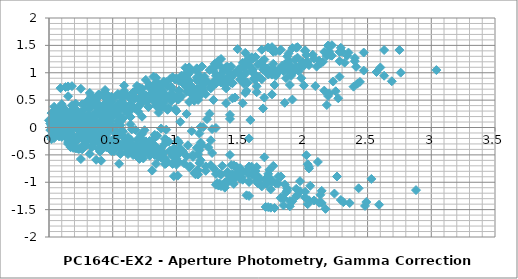
| Category | Series 0 |
|---|---|
| 0.1899999999999995 | 0.112 |
| 1.8800000000000008 | 1.221 |
| 0.2400000000000002 | 0.2 |
| 2.1799999999999997 | 1.307 |
| 1.4399999999999995 | 0.937 |
| 1.6300000000000008 | 0.644 |
| 0.7200000000000006 | 0.435 |
| 0.47000000000000064 | 0.271 |
| 1.9499999999999993 | 1.276 |
| 1.2100000000000009 | 0.788 |
| 1.7599999999999998 | 1.383 |
| 0.13000000000000078 | -0.057 |
| 0.0600000000000005 | -0.068 |
| 0.9499999999999993 | 0.597 |
| 2.08 | 1.258 |
| 0.3800000000000008 | 0.283 |
| 1.0500000000000007 | 0.809 |
| 1.3900000000000006 | 0.792 |
| 0.7799999999999994 | 0.494 |
| 2.0700000000000003 | 1.33 |
| 2.4700000000000006 | 1.04 |
| 0.41000000000000014 | -0.103 |
| 0.4499999999999993 | 0.535 |
| 0.35999999999999943 | 0.412 |
| 1.3499999999999996 | 0.975 |
| 1.9900000000000002 | 1.166 |
| 1.9100000000000001 | 1.081 |
| 1.7799999999999994 | 1.394 |
| 0.21000000000000085 | 0.145 |
| 1.8800000000000008 | 1.352 |
| 0.4399999999999995 | 0.369 |
| 0.0600000000000005 | 0.101 |
| 0.4299999999999997 | 0.322 |
| 1.8100000000000005 | 1.4 |
| 0.040000000000000924 | -0.071 |
| 2.34 | 1.312 |
| 2.2200000000000006 | 1.312 |
| 1.5500000000000007 | 1.001 |
| 2.630000000000001 | 0.945 |
| 1.5899999999999999 | 1.022 |
| 1.540000000000001 | 1.364 |
| 1.2599999999999998 | 1.047 |
| 0.9000000000000004 | 0.841 |
| 1.1600000000000001 | 1.031 |
| 1.6900000000000013 | 1.109 |
| 0.05000000000000071 | 0.088 |
| 1.9900000000000002 | 1.195 |
| 1.25 | 0.825 |
| 1.4400000000000013 | 0.533 |
| 0.5300000000000011 | 0.323 |
| 0.28000000000000114 | 0.16 |
| 1.7599999999999998 | 1.164 |
| 1.0200000000000014 | 0.676 |
| 1.5700000000000003 | 1.271 |
| 0.3200000000000003 | -0.169 |
| 0.129999999999999 | -0.18 |
| 0.7599999999999998 | 0.485 |
| 1.8900000000000006 | 1.146 |
| 0.19000000000000128 | 0.171 |
| 0.8600000000000012 | 0.697 |
| 1.200000000000001 | 0.68 |
| 0.5899999999999999 | 0.382 |
| 1.8800000000000008 | 1.218 |
| 2.280000000000001 | 0.928 |
| 0.5999999999999996 | -0.215 |
| 0.2599999999999998 | 0.423 |
| 0.16999999999999993 | 0.3 |
| 1.1600000000000001 | 0.863 |
| 1.8000000000000007 | 1.054 |
| 1.7200000000000006 | 0.969 |
| 1.5899999999999999 | 1.282 |
| 0.02000000000000135 | 0.033 |
| 1.6900000000000013 | 1.241 |
| 0.25 | 0.257 |
| 0.25 | -0.011 |
| 0.2400000000000002 | 0.21 |
| 1.620000000000001 | 1.288 |
| 0.14999999999999858 | -0.183 |
| 2.1500000000000004 | 1.2 |
| 2.030000000000001 | 1.2 |
| 1.3600000000000012 | 0.889 |
| 2.4400000000000013 | 0.833 |
| 1.4000000000000004 | 0.91 |
| 1.3500000000000014 | 1.252 |
| 1.0700000000000003 | 0.935 |
| 0.7100000000000009 | 0.729 |
| 0.9700000000000006 | 0.919 |
| 1.6400000000000006 | -1.021 |
| 0.29999999999999893 | 0.086 |
| 0.4400000000000013 | -0.285 |
| 0.25 | -0.577 |
| 1.1600000000000001 | -0.786 |
| 1.4100000000000001 | -0.95 |
| 0.06999999999999851 | 0.055 |
| 0.6699999999999999 | -0.433 |
| 0.120000000000001 | 0.162 |
| 2.0100000000000016 | -1.278 |
| 1.8200000000000003 | -1.289 |
| 0.9300000000000015 | -0.624 |
| 0.1999999999999993 | 0.037 |
| 1.5 | -0.938 |
| 0.8300000000000001 | -0.412 |
| 0.4900000000000002 | -0.429 |
| 1.1000000000000014 | -0.727 |
| 0.1899999999999995 | 0.108 |
| 0.5899999999999999 | -0.181 |
| 2.290000000000001 | -1.324 |
| 1.4300000000000015 | -0.686 |
| 1.5200000000000014 | -0.809 |
| 0.5300000000000011 | -0.246 |
| 0.10999999999999943 | -0.055 |
| 0.02999999999999936 | -0.14 |
| 0.10000000000000142 | 0.173 |
| 1.67 | -1.076 |
| 0.0 | 0.131 |
| 1.4400000000000013 | -0.852 |
| 1.9400000000000013 | -1.12 |
| 1.450000000000001 | -0.899 |
| 0.07000000000000028 | 0.179 |
| 1.8399999999999999 | -1.292 |
| 0.4599999999999991 | 0.091 |
| 0.33999999999999986 | 0.091 |
| 0.33000000000000007 | -0.22 |
| 0.75 | -0.276 |
| 0.2900000000000009 | -0.199 |
| 0.33999999999999986 | 0.142 |
| 0.620000000000001 | -0.174 |
| 0.9800000000000004 | -0.38 |
| 0.7200000000000006 | -0.19 |
| 1.9399999999999995 | 1.107 |
| 1.1999999999999993 | 0.737 |
| 1.3900000000000006 | 0.445 |
| 0.4800000000000004 | 0.236 |
| 0.23000000000000043 | 0.072 |
| 1.709999999999999 | 1.076 |
| 0.9700000000000006 | 0.588 |
| 1.5199999999999996 | 1.183 |
| 0.370000000000001 | -0.256 |
| 0.17999999999999972 | -0.268 |
| 0.7099999999999991 | 0.397 |
| 1.8399999999999999 | 1.058 |
| 0.14000000000000057 | 0.084 |
| 0.8100000000000005 | 0.609 |
| 1.1500000000000004 | 0.593 |
| 0.5399999999999991 | 0.295 |
| 1.83 | 1.13 |
| 2.2300000000000004 | 0.84 |
| 0.6500000000000004 | -0.303 |
| 0.20999999999999908 | 0.335 |
| 0.11999999999999922 | 0.212 |
| 1.1099999999999994 | 0.775 |
| 1.75 | 0.966 |
| 1.67 | 0.882 |
| 1.5399999999999991 | 1.194 |
| 0.02999999999999936 | -0.055 |
| 1.6400000000000006 | 1.153 |
| 0.1999999999999993 | 0.169 |
| 0.3000000000000007 | -0.099 |
| 0.1899999999999995 | 0.123 |
| 1.5700000000000003 | 1.2 |
| 0.1999999999999993 | -0.27 |
| 2.0999999999999996 | 1.113 |
| 1.9800000000000004 | 1.112 |
| 1.3100000000000005 | 0.801 |
| 2.3900000000000006 | 0.746 |
| 1.3499999999999996 | 0.823 |
| 1.3000000000000007 | 1.164 |
| 1.0199999999999996 | 0.847 |
| 0.6600000000000001 | 0.641 |
| 0.9199999999999999 | 0.831 |
| 0.7400000000000002 | -0.37 |
| 0.5499999999999989 | -0.663 |
| 1.459999999999999 | -0.872 |
| 1.709999999999999 | -1.036 |
| 0.23000000000000043 | -0.031 |
| 0.9699999999999989 | -0.519 |
| 0.41999999999999993 | 0.076 |
| 2.3100000000000005 | -1.364 |
| 2.119999999999999 | -1.375 |
| 1.2300000000000004 | -0.71 |
| 0.09999999999999964 | -0.049 |
| 1.799999999999999 | -1.024 |
| 1.129999999999999 | -0.498 |
| 0.7899999999999991 | -0.515 |
| 1.4000000000000004 | -0.813 |
| 0.10999999999999943 | 0.022 |
| 0.2900000000000009 | -0.267 |
| 2.59 | -1.41 |
| 1.7300000000000004 | -0.772 |
| 1.8200000000000003 | -0.895 |
| 0.8300000000000001 | -0.332 |
| 0.1899999999999995 | -0.141 |
| 0.2699999999999996 | -0.226 |
| 0.40000000000000036 | 0.087 |
| 1.9699999999999989 | -1.162 |
| 0.29999999999999893 | 0.045 |
| 1.7400000000000002 | -0.938 |
| 2.24 | -1.206 |
| 1.75 | -0.985 |
| 0.3699999999999992 | 0.093 |
| 2.139999999999999 | -1.378 |
| 0.16000000000000014 | 0.005 |
| 0.040000000000000924 | 0.005 |
| 0.629999999999999 | -0.306 |
| 0.45000000000000107 | -0.362 |
| 0.5899999999999999 | -0.285 |
| 0.6399999999999988 | 0.056 |
| 0.9199999999999999 | -0.26 |
| 1.2799999999999994 | -0.466 |
| 1.0199999999999996 | -0.276 |
| 0.19000000000000128 | -0.292 |
| 0.7199999999999989 | -0.501 |
| 0.9699999999999989 | -0.665 |
| 0.5099999999999998 | 0.339 |
| 0.22999999999999865 | -0.149 |
| 0.3200000000000003 | 0.446 |
| 1.5700000000000003 | -0.993 |
| 1.379999999999999 | -1.004 |
| 0.4900000000000002 | -0.34 |
| 0.6400000000000006 | 0.321 |
| 1.0599999999999987 | -0.653 |
| 0.3899999999999988 | -0.128 |
| 0.049999999999998934 | -0.144 |
| 0.6600000000000001 | -0.442 |
| 0.6300000000000008 | 0.393 |
| 1.0300000000000011 | 0.103 |
| 1.8499999999999996 | -1.04 |
| 0.9900000000000002 | -0.402 |
| 1.08 | -0.525 |
| 0.08999999999999986 | 0.038 |
| 0.5500000000000007 | 0.229 |
| 0.47000000000000064 | 0.145 |
| 0.33999999999999986 | 0.457 |
| 1.2299999999999986 | -0.792 |
| 0.4400000000000013 | 0.416 |
| 1.0 | -0.568 |
| 1.5 | -0.836 |
| 1.0099999999999998 | -0.614 |
| 0.370000000000001 | 0.463 |
| 1.3999999999999986 | -1.007 |
| 0.9000000000000004 | 0.376 |
| 0.7800000000000011 | 0.375 |
| 0.11000000000000121 | 0.064 |
| 1.1900000000000013 | 0.009 |
| 0.15000000000000036 | 0.086 |
| 0.10000000000000142 | 0.427 |
| 0.17999999999999972 | 0.11 |
| 0.5399999999999991 | -0.096 |
| 0.27999999999999936 | 0.094 |
| 0.9100000000000001 | -0.209 |
| 1.1600000000000001 | -0.373 |
| 0.3199999999999985 | 0.631 |
| 0.41999999999999993 | 0.143 |
| 0.129999999999999 | 0.738 |
| 1.7600000000000016 | -0.701 |
| 1.5700000000000003 | -0.712 |
| 0.6800000000000015 | -0.047 |
| 0.4499999999999993 | 0.613 |
| 1.25 | -0.361 |
| 0.5800000000000001 | 0.164 |
| 0.2400000000000002 | 0.148 |
| 0.8500000000000014 | -0.15 |
| 0.4399999999999995 | 0.685 |
| 0.8399999999999999 | 0.395 |
| 2.040000000000001 | -0.748 |
| 1.1800000000000015 | -0.11 |
| 1.2700000000000014 | -0.233 |
| 0.28000000000000114 | 0.33 |
| 0.35999999999999943 | 0.521 |
| 0.27999999999999936 | 0.437 |
| 0.14999999999999858 | 0.75 |
| 1.42 | -0.5 |
| 0.25 | 0.708 |
| 1.1900000000000013 | -0.276 |
| 1.6900000000000013 | -0.544 |
| 1.200000000000001 | -0.322 |
| 0.17999999999999972 | 0.755 |
| 1.5899999999999999 | -0.715 |
| 0.7099999999999991 | 0.668 |
| 0.5899999999999999 | 0.667 |
| 0.08000000000000007 | 0.356 |
| 1.0 | 0.301 |
| 0.040000000000000924 | 0.378 |
| 0.08999999999999986 | 0.719 |
| 0.370000000000001 | 0.402 |
| 0.7300000000000004 | 0.196 |
| 0.47000000000000064 | 0.386 |
| 0.25 | -0.164 |
| 1.2299999999999986 | 0.841 |
| 0.4900000000000002 | 0.353 |
| 1.0399999999999991 | 0.948 |
| 0.8500000000000014 | -0.492 |
| 0.6600000000000001 | -0.503 |
| 0.22999999999999865 | 0.162 |
| 1.3599999999999994 | 0.823 |
| 0.33999999999999986 | -0.152 |
| 0.33000000000000007 | 0.374 |
| 0.6699999999999999 | 0.357 |
| 0.05999999999999872 | 0.059 |
| 1.3499999999999996 | 0.894 |
| 1.75 | 0.605 |
| 1.1300000000000008 | -0.539 |
| 0.27000000000000135 | 0.099 |
| 0.3600000000000012 | -0.023 |
| 0.629999999999999 | 0.54 |
| 1.2699999999999996 | 0.73 |
| 1.1899999999999995 | 0.646 |
| 1.0599999999999987 | 0.959 |
| 0.5099999999999998 | -0.29 |
| 1.1600000000000001 | 0.917 |
| 0.28000000000000114 | -0.066 |
| 0.7800000000000011 | -0.334 |
| 0.2900000000000009 | -0.113 |
| 1.0899999999999999 | 0.965 |
| 0.6799999999999997 | -0.506 |
| 1.6199999999999992 | 0.877 |
| 1.5 | 0.877 |
| 0.8300000000000001 | 0.566 |
| 1.9100000000000001 | 0.51 |
| 0.8699999999999992 | 0.587 |
| 0.8200000000000003 | 0.928 |
| 0.5399999999999991 | 0.612 |
| 0.17999999999999972 | 0.406 |
| 0.4399999999999995 | 0.596 |
| 1.4799999999999986 | 1.004 |
| 0.7400000000000002 | 0.516 |
| 1.2899999999999991 | 1.111 |
| 0.6000000000000014 | -0.328 |
| 0.41000000000000014 | -0.339 |
| 0.47999999999999865 | 0.326 |
| 1.6099999999999994 | 0.987 |
| 0.08999999999999986 | 0.012 |
| 0.5800000000000001 | 0.537 |
| 0.9199999999999999 | 0.521 |
| 0.3099999999999987 | 0.223 |
| 1.5999999999999996 | 1.058 |
| 2.0 | 0.769 |
| 0.8800000000000008 | -0.375 |
| 0.02000000000000135 | 0.263 |
| 0.11000000000000121 | 0.14 |
| 0.879999999999999 | 0.703 |
| 1.5199999999999996 | 0.894 |
| 1.4399999999999995 | 0.81 |
| 1.3099999999999987 | 1.123 |
| 0.2599999999999998 | -0.127 |
| 1.4100000000000001 | 1.081 |
| 0.030000000000001137 | 0.097 |
| 0.5300000000000011 | -0.171 |
| 0.040000000000000924 | 0.051 |
| 1.3399999999999999 | 1.128 |
| 0.4299999999999997 | -0.342 |
| 1.8699999999999992 | 1.041 |
| 1.75 | 1.041 |
| 1.08 | 0.729 |
| 2.16 | 0.674 |
| 1.1199999999999992 | 0.751 |
| 1.0700000000000003 | 1.092 |
| 0.7899999999999991 | 0.775 |
| 0.4299999999999997 | 0.57 |
| 0.6899999999999995 | 0.759 |
| 0.7399999999999984 | -0.488 |
| 0.1899999999999995 | 0.107 |
| 2.08 | -1.332 |
| 1.8899999999999988 | -1.344 |
| 1.0 | -0.679 |
| 0.13000000000000078 | -0.018 |
| 1.5699999999999985 | -0.992 |
| 0.8999999999999986 | -0.467 |
| 0.5599999999999987 | -0.483 |
| 1.17 | -0.781 |
| 0.120000000000001 | 0.054 |
| 0.5200000000000014 | -0.236 |
| 2.3599999999999994 | -1.379 |
| 1.5 | -0.741 |
| 1.5899999999999999 | -0.864 |
| 0.5999999999999996 | -0.301 |
| 0.040000000000000924 | -0.11 |
| 0.03999999999999915 | -0.194 |
| 0.16999999999999993 | 0.118 |
| 1.7399999999999984 | -1.131 |
| 0.06999999999999851 | 0.077 |
| 1.5099999999999998 | -0.907 |
| 2.01 | -1.175 |
| 1.5199999999999996 | -0.954 |
| 0.1399999999999988 | 0.124 |
| 1.9099999999999984 | -1.346 |
| 0.39000000000000057 | 0.037 |
| 0.27000000000000135 | 0.036 |
| 0.3999999999999986 | -0.275 |
| 0.6800000000000015 | -0.33 |
| 0.35999999999999943 | -0.253 |
| 0.40999999999999837 | 0.088 |
| 0.6899999999999995 | -0.229 |
| 1.049999999999999 | -0.435 |
| 0.7899999999999991 | -0.245 |
| 0.5499999999999989 | 0.595 |
| 1.3400000000000016 | -0.845 |
| 1.1500000000000004 | -0.856 |
| 0.26000000000000156 | -0.191 |
| 0.8699999999999992 | 0.47 |
| 0.8300000000000001 | -0.505 |
| 0.16000000000000014 | 0.021 |
| 0.17999999999999972 | 0.004 |
| 0.4300000000000015 | -0.294 |
| 0.8599999999999994 | 0.542 |
| 1.2599999999999998 | 0.252 |
| 1.620000000000001 | -0.891 |
| 0.7600000000000016 | -0.253 |
| 0.8500000000000014 | -0.376 |
| 0.1399999999999988 | 0.187 |
| 0.7799999999999994 | 0.378 |
| 0.6999999999999993 | 0.293 |
| 0.5699999999999985 | 0.606 |
| 1.0 | -0.643 |
| 0.6699999999999999 | 0.565 |
| 0.7700000000000014 | -0.419 |
| 1.2700000000000014 | -0.687 |
| 0.7800000000000011 | -0.466 |
| 0.5999999999999996 | 0.612 |
| 1.17 | -0.859 |
| 1.129999999999999 | 0.525 |
| 1.0099999999999998 | 0.524 |
| 0.33999999999999986 | 0.213 |
| 1.42 | 0.157 |
| 0.379999999999999 | 0.234 |
| 0.33000000000000007 | 0.576 |
| 0.049999999999998934 | 0.259 |
| 0.3100000000000005 | 0.053 |
| 0.05000000000000071 | 0.243 |
| 1.8900000000000006 | -1.439 |
| 1.6999999999999993 | -1.451 |
| 0.8100000000000005 | -0.786 |
| 0.3200000000000003 | -0.125 |
| 1.379999999999999 | -1.1 |
| 0.7099999999999991 | -0.574 |
| 0.3699999999999992 | -0.59 |
| 0.9800000000000004 | -0.889 |
| 0.3100000000000005 | -0.053 |
| 0.7100000000000009 | -0.343 |
| 2.17 | -1.486 |
| 1.3100000000000005 | -0.848 |
| 1.4000000000000004 | -0.971 |
| 0.41000000000000014 | -0.408 |
| 0.23000000000000043 | -0.217 |
| 0.15000000000000036 | -0.302 |
| 0.019999999999999574 | 0.011 |
| 1.549999999999999 | -1.238 |
| 0.120000000000001 | -0.03 |
| 1.3200000000000003 | -1.014 |
| 1.8200000000000003 | -1.282 |
| 1.33 | -1.061 |
| 0.05000000000000071 | 0.017 |
| 1.7199999999999989 | -1.454 |
| 0.5800000000000001 | -0.07 |
| 0.46000000000000085 | -0.071 |
| 0.20999999999999908 | -0.382 |
| 0.870000000000001 | -0.438 |
| 0.16999999999999993 | -0.36 |
| 0.21999999999999886 | -0.019 |
| 0.5 | -0.336 |
| 0.8599999999999994 | -0.542 |
| 0.5999999999999996 | -0.352 |
| 0.19000000000000128 | -0.011 |
| 1.08 | 0.654 |
| 2.210000000000001 | 1.315 |
| 0.5100000000000016 | 0.34 |
| 1.1800000000000015 | 0.865 |
| 1.5200000000000014 | 0.849 |
| 0.9100000000000001 | 0.551 |
| 2.200000000000001 | 1.386 |
| 2.6000000000000014 | 1.097 |
| 0.27999999999999936 | -0.047 |
| 0.5800000000000001 | 0.591 |
| 0.4900000000000002 | 0.468 |
| 1.4800000000000004 | 1.032 |
| 2.120000000000001 | 1.222 |
| 2.040000000000001 | 1.138 |
| 1.9100000000000001 | 1.451 |
| 0.34000000000000163 | 0.201 |
| 2.0100000000000016 | 1.409 |
| 0.5700000000000003 | 0.426 |
| 0.07000000000000028 | 0.157 |
| 0.5600000000000005 | 0.379 |
| 1.9400000000000013 | 1.456 |
| 0.1700000000000017 | -0.014 |
| 2.4700000000000006 | 1.369 |
| 2.3500000000000014 | 1.369 |
| 1.6800000000000015 | 1.057 |
| 2.7600000000000016 | 1.002 |
| 1.7200000000000006 | 1.079 |
| 1.6700000000000017 | 1.42 |
| 1.3900000000000006 | 1.104 |
| 1.0300000000000011 | 0.898 |
| 1.290000000000001 | 1.087 |
| 0.8899999999999988 | 0.665 |
| 2.0199999999999996 | 1.326 |
| 0.3200000000000003 | 0.351 |
| 0.9900000000000002 | 0.877 |
| 1.33 | 0.86 |
| 0.7199999999999989 | 0.562 |
| 2.01 | 1.397 |
| 2.41 | 1.108 |
| 0.47000000000000064 | -0.035 |
| 0.3899999999999988 | 0.603 |
| 0.29999999999999893 | 0.48 |
| 1.2899999999999991 | 1.043 |
| 1.9299999999999997 | 1.234 |
| 1.8499999999999996 | 1.149 |
| 1.7199999999999989 | 1.462 |
| 0.15000000000000036 | 0.213 |
| 1.8200000000000003 | 1.42 |
| 0.379999999999999 | 0.437 |
| 0.120000000000001 | 0.169 |
| 0.3699999999999992 | 0.39 |
| 1.75 | 1.468 |
| 0.019999999999999574 | -0.003 |
| 2.2799999999999994 | 1.38 |
| 2.16 | 1.38 |
| 1.4900000000000002 | 1.069 |
| 2.5700000000000003 | 1.013 |
| 1.5299999999999994 | 1.09 |
| 1.4800000000000004 | 1.431 |
| 1.1999999999999993 | 1.115 |
| 0.8399999999999999 | 0.909 |
| 1.0999999999999996 | 1.099 |
| 1.1300000000000008 | 0.661 |
| 0.5699999999999985 | -0.314 |
| 0.10000000000000142 | 0.212 |
| 0.4400000000000013 | 0.195 |
| 0.16999999999999993 | -0.103 |
| 1.120000000000001 | 0.733 |
| 1.5200000000000014 | 0.443 |
| 1.3599999999999994 | -0.7 |
| 0.5 | -0.062 |
| 0.5899999999999999 | -0.185 |
| 0.40000000000000036 | 0.378 |
| 1.040000000000001 | 0.569 |
| 0.9600000000000009 | 0.484 |
| 0.8300000000000001 | 0.797 |
| 0.7399999999999984 | -0.452 |
| 0.9300000000000015 | 0.756 |
| 0.5099999999999998 | -0.228 |
| 1.0099999999999998 | -0.496 |
| 0.5199999999999996 | -0.275 |
| 0.8600000000000012 | 0.803 |
| 0.9099999999999984 | -0.668 |
| 1.3900000000000006 | 0.715 |
| 1.2700000000000014 | 0.715 |
| 0.6000000000000014 | 0.404 |
| 1.6800000000000015 | 0.348 |
| 0.6400000000000006 | 0.425 |
| 0.5900000000000016 | 0.767 |
| 0.3100000000000005 | 0.45 |
| 0.049999999999998934 | 0.244 |
| 0.21000000000000085 | 0.434 |
| 1.6999999999999993 | -0.975 |
| 1.0299999999999994 | -0.449 |
| 0.6899999999999995 | -0.466 |
| 1.3000000000000007 | -0.764 |
| 0.009999999999999787 | 0.072 |
| 0.39000000000000057 | -0.218 |
| 2.49 | -1.361 |
| 1.6300000000000008 | -0.723 |
| 1.7200000000000006 | -0.846 |
| 0.7300000000000004 | -0.283 |
| 0.08999999999999986 | -0.092 |
| 0.16999999999999993 | -0.177 |
| 0.3000000000000007 | 0.136 |
| 1.8699999999999992 | -1.113 |
| 0.1999999999999993 | 0.095 |
| 1.6400000000000006 | -0.889 |
| 2.1400000000000006 | -1.157 |
| 1.6500000000000004 | -0.936 |
| 0.2699999999999996 | 0.142 |
| 2.039999999999999 | -1.329 |
| 0.2599999999999998 | 0.054 |
| 0.14000000000000057 | 0.054 |
| 0.5299999999999994 | -0.257 |
| 0.5500000000000007 | -0.313 |
| 0.4900000000000002 | -0.236 |
| 0.5399999999999991 | 0.106 |
| 0.8200000000000003 | -0.211 |
| 1.1799999999999997 | -0.417 |
| 0.9199999999999999 | -0.227 |
| 0.6699999999999999 | 0.526 |
| 1.0099999999999998 | 0.509 |
| 0.3999999999999986 | 0.211 |
| 1.6899999999999995 | 1.046 |
| 2.09 | 0.757 |
| 0.7900000000000009 | -0.387 |
| 0.06999999999999851 | 0.251 |
| 0.02000000000000135 | 0.129 |
| 0.9699999999999989 | 0.692 |
| 1.6099999999999994 | 0.882 |
| 1.5299999999999994 | 0.798 |
| 1.3999999999999986 | 1.111 |
| 0.16999999999999993 | -0.138 |
| 1.5 | 1.069 |
| 0.05999999999999872 | 0.086 |
| 0.4400000000000013 | -0.183 |
| 0.049999999999998934 | 0.039 |
| 1.4299999999999997 | 1.117 |
| 0.33999999999999986 | -0.354 |
| 1.959999999999999 | 1.029 |
| 1.8399999999999999 | 1.029 |
| 1.17 | 0.718 |
| 2.25 | 0.662 |
| 1.209999999999999 | 0.739 |
| 1.1600000000000001 | 1.08 |
| 0.879999999999999 | 0.764 |
| 0.5199999999999996 | 0.558 |
| 0.7799999999999994 | 0.748 |
| 0.33999999999999986 | -0.016 |
| 0.27000000000000135 | -0.315 |
| 1.0199999999999996 | 0.521 |
| 1.42 | 0.231 |
| 1.4600000000000009 | -0.912 |
| 0.6000000000000014 | -0.274 |
| 0.6900000000000013 | -0.397 |
| 0.29999999999999893 | 0.166 |
| 0.9399999999999995 | 0.357 |
| 0.8599999999999994 | 0.272 |
| 0.7299999999999986 | 0.585 |
| 0.8399999999999999 | -0.664 |
| 0.8300000000000001 | 0.544 |
| 0.6100000000000012 | -0.44 |
| 1.1100000000000012 | -0.708 |
| 0.620000000000001 | -0.487 |
| 0.7599999999999998 | 0.591 |
| 1.0099999999999998 | -0.88 |
| 1.2899999999999991 | 0.504 |
| 1.17 | 0.503 |
| 0.5 | 0.192 |
| 1.58 | 0.136 |
| 0.5399999999999991 | 0.213 |
| 0.4900000000000002 | 0.555 |
| 0.20999999999999908 | 0.238 |
| 0.15000000000000036 | 0.032 |
| 0.10999999999999943 | 0.222 |
| 0.6100000000000012 | -0.298 |
| 0.6799999999999997 | 0.537 |
| 1.08 | 0.248 |
| 1.8000000000000007 | -0.896 |
| 0.9400000000000013 | -0.258 |
| 1.0300000000000011 | -0.381 |
| 0.040000000000000924 | 0.183 |
| 0.5999999999999996 | 0.373 |
| 0.5199999999999996 | 0.289 |
| 0.3899999999999988 | 0.602 |
| 1.1799999999999997 | -0.648 |
| 0.4900000000000002 | 0.56 |
| 0.9500000000000011 | -0.423 |
| 1.450000000000001 | -0.692 |
| 0.9600000000000009 | -0.47 |
| 0.41999999999999993 | 0.608 |
| 1.3499999999999996 | -0.863 |
| 0.9499999999999993 | 0.52 |
| 0.8300000000000001 | 0.52 |
| 0.16000000000000014 | 0.208 |
| 1.2400000000000002 | 0.153 |
| 0.1999999999999993 | 0.23 |
| 0.15000000000000036 | 0.571 |
| 0.13000000000000078 | 0.255 |
| 0.4900000000000002 | 0.049 |
| 0.23000000000000043 | 0.238 |
| 1.290000000000001 | 0.835 |
| 1.6900000000000013 | 0.546 |
| 1.1899999999999995 | -0.598 |
| 0.33000000000000007 | 0.04 |
| 0.41999999999999993 | -0.082 |
| 0.5700000000000003 | 0.481 |
| 1.2100000000000009 | 0.671 |
| 1.1300000000000008 | 0.587 |
| 1.0 | 0.9 |
| 0.5699999999999985 | -0.349 |
| 1.1000000000000014 | 0.858 |
| 0.33999999999999986 | -0.125 |
| 0.8399999999999999 | -0.393 |
| 0.34999999999999964 | -0.172 |
| 1.0300000000000011 | 0.906 |
| 0.7399999999999984 | -0.565 |
| 1.5600000000000005 | 0.818 |
| 1.4400000000000013 | 0.818 |
| 0.7700000000000014 | 0.507 |
| 1.8500000000000014 | 0.451 |
| 0.8100000000000005 | 0.528 |
| 0.7600000000000016 | 0.869 |
| 0.4800000000000004 | 0.553 |
| 0.120000000000001 | 0.347 |
| 0.3800000000000008 | 0.537 |
| 0.40000000000000036 | -0.29 |
| 2.4800000000000004 | -1.433 |
| 1.620000000000001 | -0.795 |
| 1.7100000000000009 | -0.918 |
| 0.7200000000000006 | -0.355 |
| 0.08000000000000007 | -0.164 |
| 0.16000000000000014 | -0.248 |
| 0.2900000000000009 | 0.064 |
| 1.8599999999999994 | -1.185 |
| 0.1899999999999995 | 0.023 |
| 1.6300000000000008 | -0.961 |
| 2.130000000000001 | -1.229 |
| 1.6400000000000006 | -1.007 |
| 0.2599999999999998 | 0.07 |
| 2.0299999999999994 | -1.4 |
| 0.2699999999999996 | -0.017 |
| 0.15000000000000036 | -0.018 |
| 0.5199999999999996 | -0.329 |
| 0.5600000000000005 | -0.384 |
| 0.4800000000000004 | -0.307 |
| 0.5299999999999994 | 0.034 |
| 0.8100000000000005 | -0.283 |
| 1.17 | -0.489 |
| 0.9100000000000001 | -0.299 |
| 2.880000000000001 | -1.143 |
| 2.0200000000000014 | -0.505 |
| 2.110000000000001 | -0.628 |
| 1.120000000000001 | -0.065 |
| 0.4800000000000004 | 0.126 |
| 0.5600000000000005 | 0.041 |
| 0.6900000000000013 | 0.354 |
| 2.26 | -0.895 |
| 0.5899999999999999 | 0.313 |
| 2.030000000000001 | -0.671 |
| 2.530000000000001 | -0.939 |
| 2.040000000000001 | -0.718 |
| 0.6600000000000001 | 0.36 |
| 2.4299999999999997 | -1.111 |
| 0.13000000000000078 | 0.272 |
| 0.25 | 0.272 |
| 0.9199999999999999 | -0.039 |
| 0.16000000000000014 | -0.095 |
| 0.8800000000000008 | -0.018 |
| 0.9299999999999997 | 0.324 |
| 1.2100000000000009 | 0.007 |
| 1.5700000000000003 | -0.199 |
| 1.3100000000000005 | -0.009 |
| 0.8599999999999994 | 0.638 |
| 0.7699999999999996 | 0.515 |
| 1.7599999999999998 | 1.078 |
| 2.4000000000000004 | 1.269 |
| 2.3200000000000003 | 1.185 |
| 2.1899999999999995 | 1.497 |
| 0.620000000000001 | 0.248 |
| 2.290000000000001 | 1.456 |
| 0.8499999999999996 | 0.472 |
| 0.34999999999999964 | 0.204 |
| 0.8399999999999999 | 0.426 |
| 2.2200000000000006 | 1.503 |
| 0.45000000000000107 | 0.033 |
| 2.75 | 1.416 |
| 2.630000000000001 | 1.415 |
| 1.9600000000000009 | 1.104 |
| 3.040000000000001 | 1.049 |
| 2.0 | 1.126 |
| 1.950000000000001 | 1.467 |
| 1.67 | 1.15 |
| 1.3100000000000005 | 0.944 |
| 1.5700000000000003 | 1.134 |
| 0.08999999999999986 | -0.123 |
| 0.9000000000000004 | 0.44 |
| 1.540000000000001 | 0.631 |
| 1.4600000000000009 | 0.547 |
| 1.33 | 0.859 |
| 0.23999999999999844 | -0.39 |
| 1.4300000000000015 | 0.818 |
| 0.009999999999999787 | -0.166 |
| 0.5099999999999998 | -0.434 |
| 0.019999999999999574 | -0.212 |
| 1.3600000000000012 | 0.865 |
| 0.40999999999999837 | -0.605 |
| 1.8900000000000006 | 0.778 |
| 1.7700000000000014 | 0.777 |
| 1.1000000000000014 | 0.466 |
| 2.1800000000000015 | 0.411 |
| 1.1400000000000006 | 0.488 |
| 1.0900000000000016 | 0.829 |
| 0.8100000000000005 | 0.512 |
| 0.45000000000000107 | 0.306 |
| 0.7100000000000009 | 0.496 |
| 0.9900000000000002 | 0.563 |
| 1.6300000000000008 | 0.754 |
| 1.5500000000000007 | 0.669 |
| 1.42 | 0.982 |
| 0.14999999999999858 | -0.267 |
| 1.5200000000000014 | 0.941 |
| 0.08000000000000007 | -0.043 |
| 0.41999999999999993 | -0.311 |
| 0.07000000000000028 | -0.09 |
| 1.450000000000001 | 0.988 |
| 0.3199999999999985 | -0.483 |
| 1.9800000000000004 | 0.901 |
| 1.8600000000000012 | 0.9 |
| 1.1900000000000013 | 0.589 |
| 2.2700000000000014 | 0.533 |
| 1.2300000000000004 | 0.61 |
| 1.1800000000000015 | 0.952 |
| 0.9000000000000004 | 0.635 |
| 0.5400000000000009 | 0.429 |
| 0.8000000000000007 | 0.619 |
| 0.6400000000000006 | 0.191 |
| 0.5600000000000005 | 0.106 |
| 0.4299999999999997 | 0.419 |
| 1.1399999999999988 | -0.83 |
| 0.5300000000000011 | 0.378 |
| 0.9100000000000001 | -0.606 |
| 1.4100000000000001 | -0.874 |
| 0.9199999999999999 | -0.653 |
| 0.46000000000000085 | 0.425 |
| 1.3099999999999987 | -1.046 |
| 0.9900000000000002 | 0.338 |
| 0.870000000000001 | 0.337 |
| 0.20000000000000107 | 0.026 |
| 1.2800000000000011 | -0.03 |
| 0.2400000000000002 | 0.047 |
| 0.19000000000000128 | 0.389 |
| 0.08999999999999986 | 0.072 |
| 0.4499999999999993 | -0.134 |
| 0.1899999999999995 | 0.056 |
| 0.08000000000000007 | -0.084 |
| 0.21000000000000085 | 0.228 |
| 1.7799999999999994 | -1.021 |
| 0.10999999999999943 | 0.187 |
| 1.5500000000000007 | -0.797 |
| 2.0500000000000007 | -1.065 |
| 1.5600000000000005 | -0.844 |
| 0.17999999999999972 | 0.234 |
| 1.9499999999999993 | -1.236 |
| 0.34999999999999964 | 0.147 |
| 0.23000000000000043 | 0.146 |
| 0.4399999999999995 | -0.165 |
| 0.6400000000000006 | -0.22 |
| 0.40000000000000036 | -0.143 |
| 0.4499999999999993 | 0.198 |
| 0.7300000000000004 | -0.119 |
| 1.0899999999999999 | -0.325 |
| 0.8300000000000001 | -0.135 |
| 0.13000000000000078 | 0.313 |
| 1.6999999999999993 | -0.936 |
| 0.02999999999999936 | 0.271 |
| 1.4700000000000006 | -0.712 |
| 1.9700000000000006 | -0.981 |
| 1.4800000000000004 | -0.759 |
| 0.09999999999999964 | 0.319 |
| 1.8699999999999992 | -1.152 |
| 0.4299999999999997 | 0.231 |
| 0.3100000000000005 | 0.231 |
| 0.35999999999999943 | -0.08 |
| 0.7200000000000006 | -0.136 |
| 0.3200000000000003 | -0.059 |
| 0.3699999999999992 | 0.282 |
| 0.6500000000000004 | -0.034 |
| 1.0099999999999998 | -0.24 |
| 0.75 | -0.05 |
| 1.5699999999999985 | -1.249 |
| 0.10000000000000142 | -0.041 |
| 1.3399999999999999 | -1.025 |
| 1.8399999999999999 | -1.293 |
| 1.3499999999999996 | -1.072 |
| 0.030000000000001137 | 0.006 |
| 1.7399999999999984 | -1.465 |
| 0.5600000000000005 | -0.082 |
| 0.4400000000000013 | -0.082 |
| 0.22999999999999865 | -0.393 |
| 0.8500000000000014 | -0.449 |
| 0.1899999999999995 | -0.372 |
| 0.23999999999999844 | -0.03 |
| 0.5199999999999996 | -0.347 |
| 0.879999999999999 | -0.553 |
| 0.6199999999999992 | -0.363 |
| 1.67 | 1.208 |
| 0.22999999999999865 | 0.224 |
| 0.27000000000000135 | -0.044 |
| 0.21999999999999886 | 0.177 |
| 1.5999999999999996 | 1.255 |
| 0.16999999999999993 | -0.216 |
| 2.129999999999999 | 1.168 |
| 2.01 | 1.167 |
| 1.3399999999999999 | 0.856 |
| 2.42 | 0.8 |
| 1.379999999999999 | 0.878 |
| 1.33 | 1.219 |
| 1.049999999999999 | 0.902 |
| 0.6899999999999995 | 0.696 |
| 0.9499999999999993 | 0.886 |
| 1.4400000000000013 | -0.984 |
| 1.9400000000000013 | -1.252 |
| 1.450000000000001 | -1.03 |
| 0.07000000000000028 | 0.047 |
| 1.8399999999999999 | -1.423 |
| 0.4599999999999991 | -0.04 |
| 0.33999999999999986 | -0.041 |
| 0.33000000000000007 | -0.352 |
| 0.75 | -0.407 |
| 0.2900000000000009 | -0.33 |
| 0.33999999999999986 | 0.011 |
| 0.620000000000001 | -0.306 |
| 0.9800000000000004 | -0.512 |
| 0.7200000000000006 | -0.322 |
| 0.5 | -0.268 |
| 0.009999999999999787 | -0.047 |
| 1.370000000000001 | 1.031 |
| 0.3999999999999986 | -0.44 |
| 1.9000000000000004 | 0.944 |
| 1.7800000000000011 | 0.943 |
| 1.1100000000000012 | 0.632 |
| 2.1900000000000013 | 0.576 |
| 1.1500000000000004 | 0.653 |
| 1.1000000000000014 | 0.995 |
| 0.8200000000000003 | 0.678 |
| 0.46000000000000085 | 0.472 |
| 0.7200000000000006 | 0.662 |
| 0.4900000000000002 | 0.221 |
| 1.870000000000001 | 1.299 |
| 0.10000000000000142 | -0.171 |
| 2.4000000000000004 | 1.212 |
| 2.280000000000001 | 1.211 |
| 1.6100000000000012 | 0.9 |
| 2.6900000000000013 | 0.845 |
| 1.6500000000000004 | 0.922 |
| 1.6000000000000014 | 1.263 |
| 1.3200000000000003 | 0.946 |
| 0.9600000000000009 | 0.74 |
| 1.2200000000000006 | 0.93 |
| 1.3800000000000008 | 1.078 |
| 0.3899999999999988 | -0.393 |
| 1.9100000000000001 | 0.99 |
| 1.790000000000001 | 0.99 |
| 1.120000000000001 | 0.679 |
| 2.200000000000001 | 0.623 |
| 1.1600000000000001 | 0.7 |
| 1.1100000000000012 | 1.041 |
| 0.8300000000000001 | 0.725 |
| 0.47000000000000064 | 0.519 |
| 0.7300000000000004 | 0.709 |
| 1.7699999999999996 | -1.471 |
| 0.5299999999999994 | -0.087 |
| 0.41000000000000014 | -0.088 |
| 0.2599999999999998 | -0.399 |
| 0.8200000000000003 | -0.455 |
| 0.22000000000000064 | -0.378 |
| 0.2699999999999996 | -0.036 |
| 0.5500000000000007 | -0.353 |
| 0.9100000000000001 | -0.559 |
| 0.6500000000000004 | -0.369 |
| 2.299999999999999 | 1.383 |